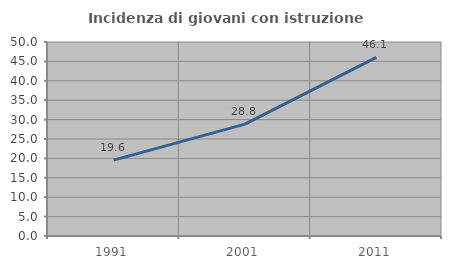
| Category | Incidenza di giovani con istruzione universitaria |
|---|---|
| 1991.0 | 19.558 |
| 2001.0 | 28.83 |
| 2011.0 | 46.051 |